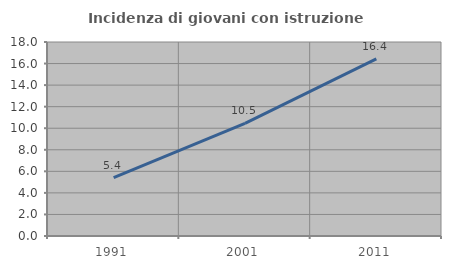
| Category | Incidenza di giovani con istruzione universitaria |
|---|---|
| 1991.0 | 5.416 |
| 2001.0 | 10.453 |
| 2011.0 | 16.433 |